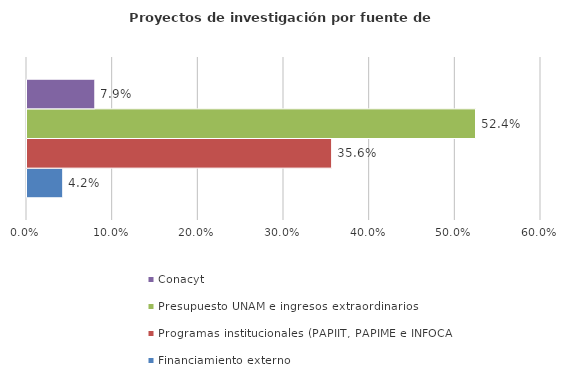
| Category | Financiamiento externo | Programas institucionales (PAPIIT, PAPIME e INFOCAB) | Presupuesto UNAM e ingresos extraordinarios | Conacyt |
|---|---|---|---|---|
| 0 | 0.042 | 0.356 | 0.524 | 0.079 |